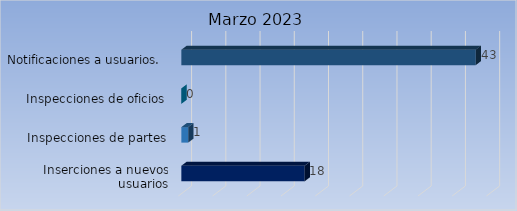
| Category | Cantidad |
|---|---|
| Inserciones a nuevos usuarios | 18 |
| Inspecciones de partes | 1 |
| Inspecciones de oficios | 0 |
| Notificaciones a usuarios.  | 43 |